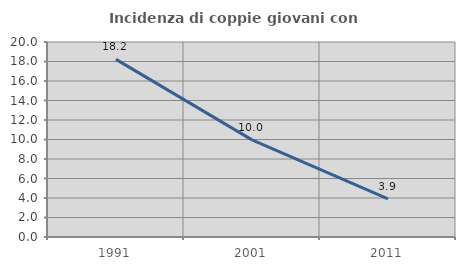
| Category | Incidenza di coppie giovani con figli |
|---|---|
| 1991.0 | 18.221 |
| 2001.0 | 9.959 |
| 2011.0 | 3.908 |